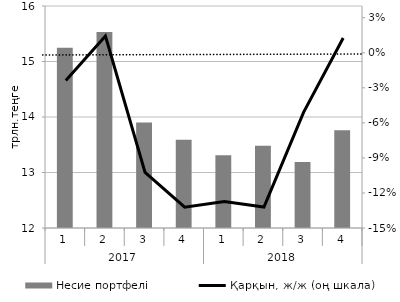
| Category | Несие портфелі |
|---|---|
| 0 | 15.25 |
| 1 | 15.53 |
| 2 | 13.9 |
| 3 | 13.59 |
| 4 | 13.31 |
| 5 | 13.48 |
| 6 | 13.19 |
| 7 | 13.76 |